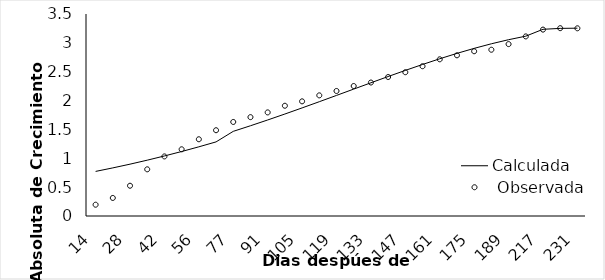
| Category | Calculada |  Observada |
|---|---|---|
| 14.0 | 0.772 | 0.196 |
| 21.0 | 0.833 | 0.313 |
| 28.0 | 0.898 | 0.524 |
| 35.0 | 0.967 | 0.809 |
| 42.0 | 1.04 | 1.032 |
| 49.0 | 1.117 | 1.156 |
| 56.0 | 1.199 | 1.33 |
| 63.0 | 1.284 | 1.486 |
| 77.0 | 1.467 | 1.629 |
| 84.0 | 1.564 | 1.713 |
| 91.0 | 1.664 | 1.795 |
| 98.0 | 1.767 | 1.91 |
| 105.0 | 1.873 | 1.987 |
| 112.0 | 1.98 | 2.09 |
| 119.0 | 2.089 | 2.166 |
| 126.0 | 2.199 | 2.252 |
| 133.0 | 2.308 | 2.313 |
| 140.0 | 2.416 | 2.408 |
| 147.0 | 2.522 | 2.491 |
| 154.0 | 2.625 | 2.595 |
| 161.0 | 2.724 | 2.715 |
| 168.0 | 2.818 | 2.784 |
| 175.0 | 2.904 | 2.855 |
| 182.0 | 2.984 | 2.881 |
| 189.0 | 3.055 | 2.978 |
| 196.0 | 3.116 | 3.112 |
| 217.0 | 3.235 | 3.23 |
| 224.0 | 3.251 | 3.255 |
| 231.0 | 3.254 | 3.252 |